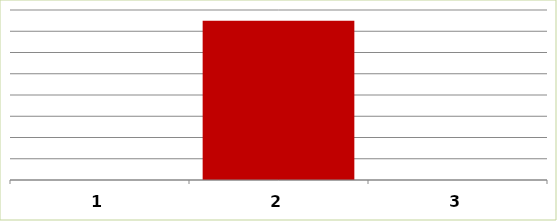
| Category | Series 0 |
|---|---|
| 0 | 0 |
| 1 | 1499203.5 |
| 2 | 0 |